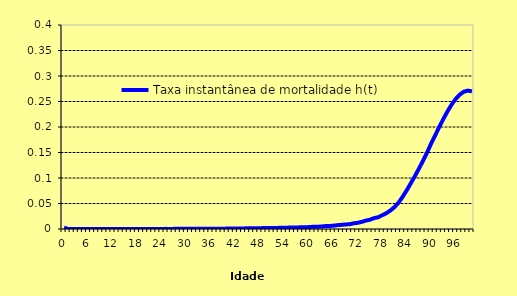
| Category | Taxa instantânea de mortalidade h(t) |
|---|---|
| 0.0 | 0.003 |
| 1.0 | 0 |
| 2.0 | 0 |
| 3.0 | 0 |
| 4.0 | 0 |
| 5.0 | 0 |
| 6.0 | 0 |
| 7.0 | 0 |
| 8.0 | 0 |
| 9.0 | 0 |
| 10.0 | 0 |
| 11.0 | 0 |
| 12.0 | 0 |
| 13.0 | 0 |
| 14.0 | 0 |
| 15.0 | 0 |
| 16.0 | 0 |
| 17.0 | 0 |
| 18.0 | 0 |
| 19.0 | 0 |
| 20.0 | 0 |
| 21.0 | 0 |
| 22.0 | 0 |
| 23.0 | 0 |
| 24.0 | 0 |
| 25.0 | 0 |
| 26.0 | 0 |
| 27.0 | 0 |
| 28.0 | 0 |
| 29.0 | 0 |
| 30.0 | 0 |
| 31.0 | 0 |
| 32.0 | 0 |
| 33.0 | 0 |
| 34.0 | 0 |
| 35.0 | 0 |
| 36.0 | 0.001 |
| 37.0 | 0.001 |
| 38.0 | 0.001 |
| 39.0 | 0.001 |
| 40.0 | 0.001 |
| 41.0 | 0.001 |
| 42.0 | 0.001 |
| 43.0 | 0.001 |
| 44.0 | 0.001 |
| 45.0 | 0.001 |
| 46.0 | 0.001 |
| 47.0 | 0.002 |
| 48.0 | 0.002 |
| 49.0 | 0.002 |
| 50.0 | 0.002 |
| 51.0 | 0.002 |
| 52.0 | 0.002 |
| 53.0 | 0.003 |
| 54.0 | 0.002 |
| 55.0 | 0.003 |
| 56.0 | 0.003 |
| 57.0 | 0.003 |
| 58.0 | 0.003 |
| 59.0 | 0.003 |
| 60.0 | 0.004 |
| 61.0 | 0.004 |
| 62.0 | 0.004 |
| 63.0 | 0.005 |
| 64.0 | 0.006 |
| 65.0 | 0.006 |
| 66.0 | 0.006 |
| 67.0 | 0.008 |
| 68.0 | 0.008 |
| 69.0 | 0.009 |
| 70.0 | 0.009 |
| 71.0 | 0.011 |
| 72.0 | 0.012 |
| 73.0 | 0.014 |
| 74.0 | 0.016 |
| 75.0 | 0.018 |
| 76.0 | 0.021 |
| 77.0 | 0.023 |
| 78.0 | 0.027 |
| 79.0 | 0.031 |
| 80.0 | 0.036 |
| 81.0 | 0.043 |
| 82.0 | 0.052 |
| 83.0 | 0.063 |
| 84.0 | 0.076 |
| 85.0 | 0.09 |
| 86.0 | 0.104 |
| 87.0 | 0.118 |
| 88.0 | 0.134 |
| 89.0 | 0.15 |
| 90.0 | 0.168 |
| 91.0 | 0.184 |
| 92.0 | 0.2 |
| 93.0 | 0.216 |
| 94.0 | 0.231 |
| 95.0 | 0.244 |
| 96.0 | 0.255 |
| 97.0 | 0.263 |
| 98.0 | 0.269 |
| 99.0 | 0.271 |
| 100.0 | 0.27 |